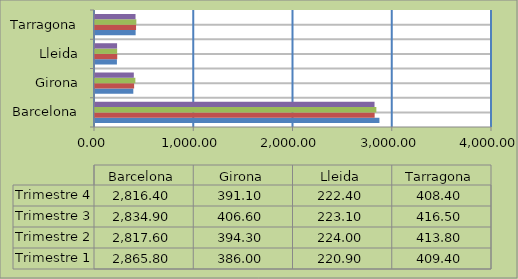
| Category | Trimestre 1 | Trimestre 2 | Trimestre 3 | Trimestre 4 |
|---|---|---|---|---|
| Barcelona | 2865.8 | 2817.6 | 2834.9 | 2816.4 |
| Girona | 386 | 394.3 | 406.6 | 391.1 |
| Lleida | 220.9 | 224 | 223.1 | 222.4 |
| Tarragona | 409.4 | 413.8 | 416.5 | 408.4 |